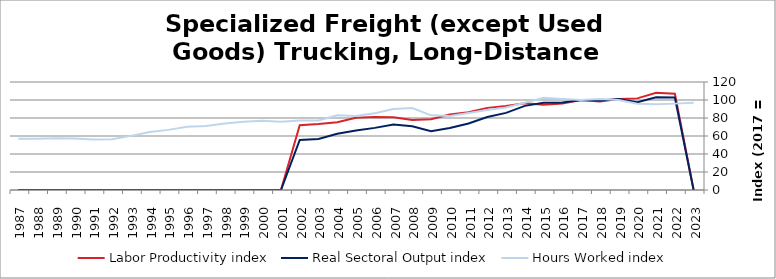
| Category | Labor Productivity index | Real Sectoral Output index | Hours Worked index |
|---|---|---|---|
| 2023.0 | 0 | 0 | 96.972 |
| 2022.0 | 106.982 | 102.673 | 95.972 |
| 2021.0 | 108.024 | 103.023 | 95.371 |
| 2020.0 | 101.802 | 97.555 | 95.828 |
| 2019.0 | 101.206 | 101.23 | 100.024 |
| 2018.0 | 98.421 | 99.539 | 101.136 |
| 2017.0 | 100 | 100 | 100 |
| 2016.0 | 96.194 | 97.209 | 101.056 |
| 2015.0 | 94.604 | 97.031 | 102.566 |
| 2014.0 | 96.329 | 93.467 | 97.029 |
| 2013.0 | 93.372 | 85.679 | 91.762 |
| 2012.0 | 91.251 | 81.161 | 88.942 |
| 2011.0 | 86.356 | 73.919 | 85.599 |
| 2010.0 | 83.855 | 68.989 | 82.271 |
| 2009.0 | 78.671 | 65.252 | 82.943 |
| 2008.0 | 77.776 | 70.756 | 90.974 |
| 2007.0 | 80.926 | 72.822 | 89.985 |
| 2006.0 | 81.007 | 69.029 | 85.214 |
| 2005.0 | 80.199 | 65.996 | 82.29 |
| 2004.0 | 75.288 | 62.466 | 82.97 |
| 2003.0 | 73.21 | 56.615 | 77.331 |
| 2002.0 | 72.077 | 55.67 | 77.237 |
| 2001.0 | 0 | 0 | 75.732 |
| 2000.0 | 0 | 0 | 76.944 |
| 1999.0 | 0 | 0 | 75.907 |
| 1998.0 | 0 | 0 | 73.894 |
| 1997.0 | 0 | 0 | 71.105 |
| 1996.0 | 0 | 0 | 70.286 |
| 1995.0 | 0 | 0 | 66.802 |
| 1994.0 | 0 | 0 | 64.347 |
| 1993.0 | 0 | 0 | 60.155 |
| 1992.0 | 0 | 0 | 56.477 |
| 1991.0 | 0 | 0 | 56.167 |
| 1990.0 | 0 | 0 | 57.265 |
| 1989.0 | 0 | 0 | 57.577 |
| 1988.0 | 0 | 0 | 56.965 |
| 1987.0 | 0 | 0 | 57.004 |